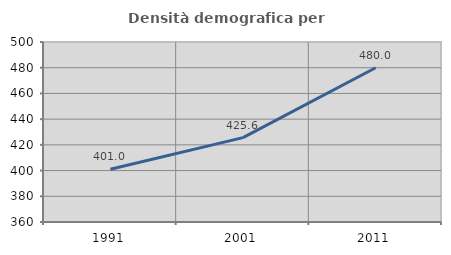
| Category | Densità demografica |
|---|---|
| 1991.0 | 401.047 |
| 2001.0 | 425.642 |
| 2011.0 | 479.987 |